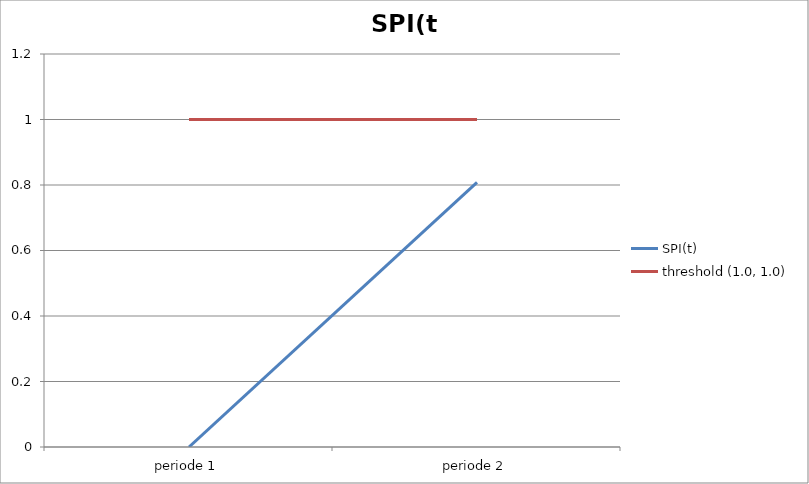
| Category | SPI(t) | threshold (1.0, 1.0) |
|---|---|---|
| periode 1 | 0 | 1 |
| periode 2 | 0.808 | 1 |